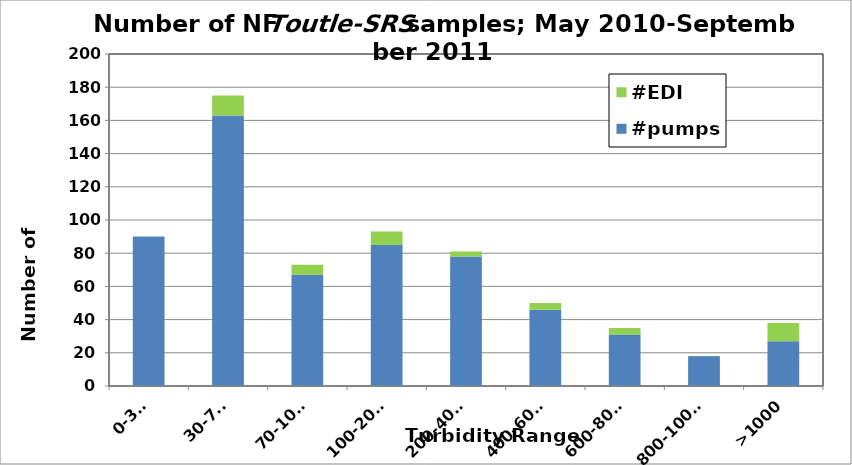
| Category | #pumps | #EDI |
|---|---|---|
| 0-30, | 90 | 0 |
| 30-70, | 163 | 12 |
| 70-100, | 67 | 6 |
| 100-200, | 85 | 8 |
| 200-400, | 78 | 3 |
| 400-600, | 46 | 4 |
| 600-800, | 31 | 4 |
| 800-1000, | 18 | 0 |
| >1000 | 27 | 11 |